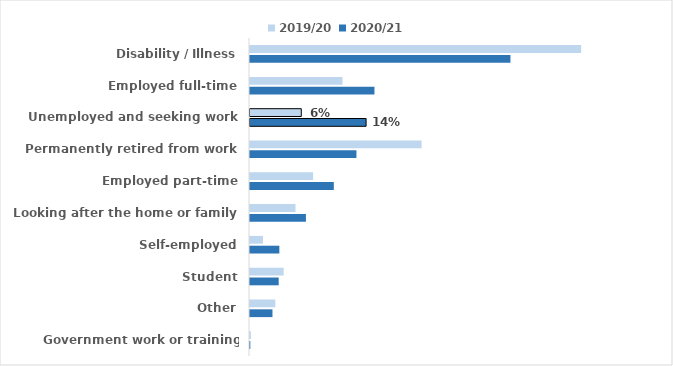
| Category | 2019/20 | 2020/21 |
|---|---|---|
| Disability / Illness | 0.4 | 0.315 |
| Employed full-time | 0.112 | 0.15 |
| Unemployed and seeking work | 0.062 | 0.14 |
| Permanently retired from work | 0.207 | 0.129 |
| Employed part-time | 0.076 | 0.101 |
| Looking after the home or family | 0.055 | 0.068 |
| Self-employed | 0.016 | 0.035 |
| Student | 0.041 | 0.035 |
| Other | 0.031 | 0.027 |
| Government work or training scheme | 0.001 | 0 |